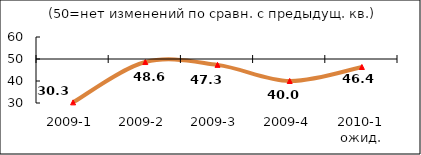
| Category | Диф.индекс ↓ |
|---|---|
| 2009-1 | 30.285 |
| 2009-2 | 48.62 |
| 2009-3 | 47.335 |
| 2009-4 | 40.005 |
| 2010-1 ожид. | 46.365 |